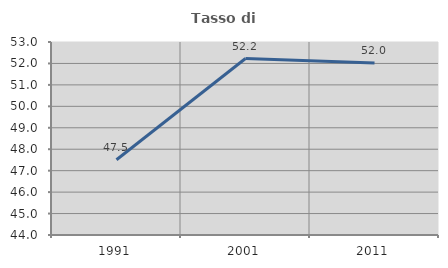
| Category | Tasso di occupazione   |
|---|---|
| 1991.0 | 47.511 |
| 2001.0 | 52.23 |
| 2011.0 | 52.015 |